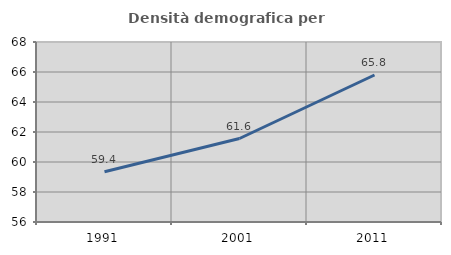
| Category | Densità demografica |
|---|---|
| 1991.0 | 59.35 |
| 2001.0 | 61.566 |
| 2011.0 | 65.801 |